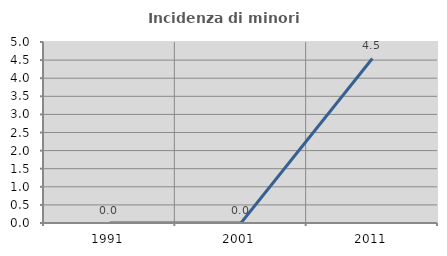
| Category | Incidenza di minori stranieri |
|---|---|
| 1991.0 | 0 |
| 2001.0 | 0 |
| 2011.0 | 4.545 |